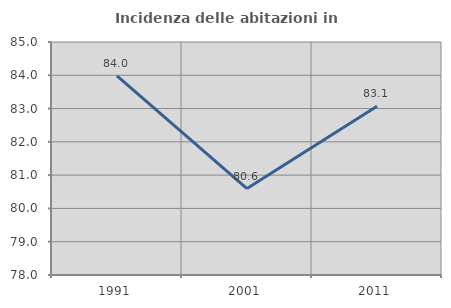
| Category | Incidenza delle abitazioni in proprietà  |
|---|---|
| 1991.0 | 83.983 |
| 2001.0 | 80.597 |
| 2011.0 | 83.067 |